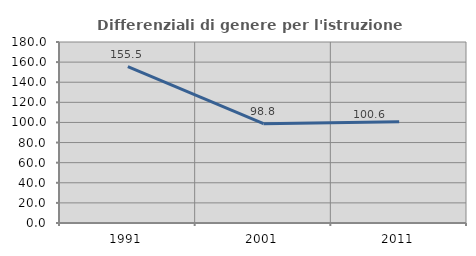
| Category | Differenziali di genere per l'istruzione superiore |
|---|---|
| 1991.0 | 155.478 |
| 2001.0 | 98.82 |
| 2011.0 | 100.645 |